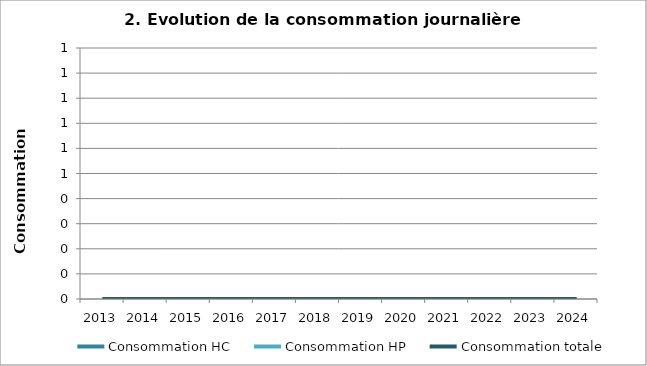
| Category | Consommation HC | Consommation HP | Consommation totale |
|---|---|---|---|
| 2013.0 | 0 | 0 | 0 |
| 2014.0 | 0 | 0 | 0 |
| 2015.0 | 0 | 0 | 0 |
| 2016.0 | 0 | 0 | 0 |
| 2017.0 | 0 | 0 | 0 |
| 2018.0 | 0 | 0 | 0 |
| 2019.0 | 0 | 0 | 0 |
| 2020.0 | 0 | 0 | 0 |
| 2021.0 | 0 | 0 | 0 |
| 2022.0 | 0 | 0 | 0 |
| 2023.0 | 0 | 0 | 0 |
| 2024.0 | 0 | 0 | 0 |